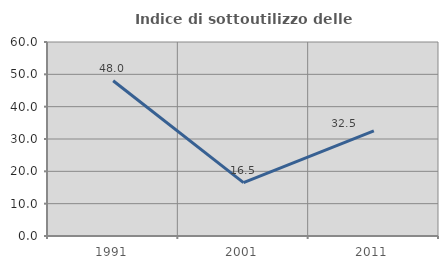
| Category | Indice di sottoutilizzo delle abitazioni  |
|---|---|
| 1991.0 | 48 |
| 2001.0 | 16.495 |
| 2011.0 | 32.53 |